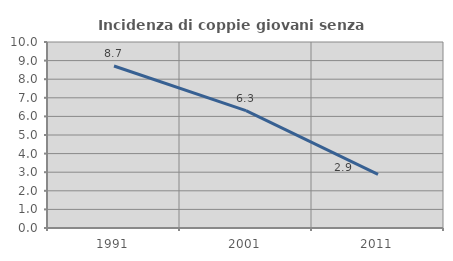
| Category | Incidenza di coppie giovani senza figli |
|---|---|
| 1991.0 | 8.71 |
| 2001.0 | 6.306 |
| 2011.0 | 2.883 |